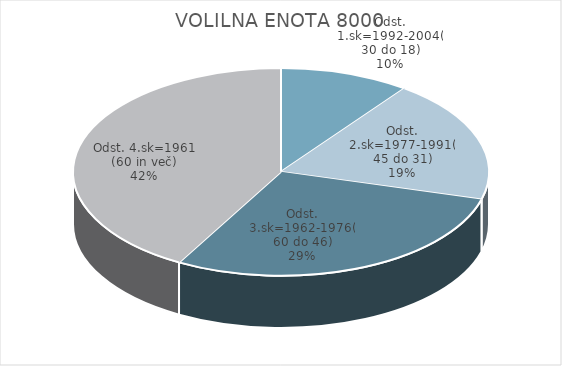
| Category | VOLILNA ENOTA 8000 |
|---|---|
| Odst. 1.sk=1992-2004(30 do 18) | 4.76 |
| Odst. 2.sk=1977-1991(45 do 31) | 9.02 |
| Odst. 3.sk=1962-1976(60 do 46) | 13.57 |
| Odst. 4.sk=1961 (60 in več) | 19.68 |